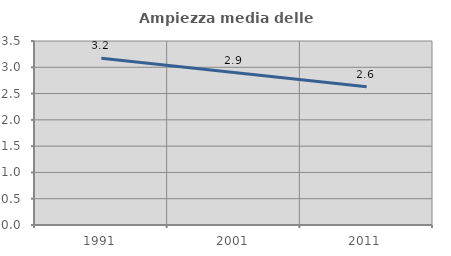
| Category | Ampiezza media delle famiglie |
|---|---|
| 1991.0 | 3.17 |
| 2001.0 | 2.9 |
| 2011.0 | 2.629 |